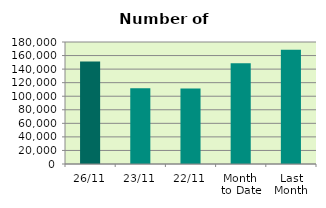
| Category | Series 0 |
|---|---|
| 26/11 | 151358 |
| 23/11 | 111870 |
| 22/11 | 111400 |
| Month 
to Date | 148692.667 |
| Last
Month | 168717.043 |